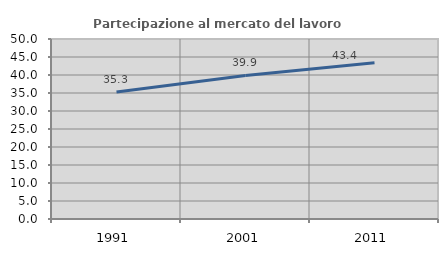
| Category | Partecipazione al mercato del lavoro  femminile |
|---|---|
| 1991.0 | 35.305 |
| 2001.0 | 39.892 |
| 2011.0 | 43.413 |